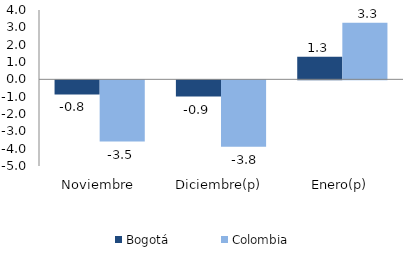
| Category | Bogotá | Colombia |
|---|---|---|
| Noviembre | -0.816 | -3.533 |
| Diciembre(p) | -0.939 | -3.835 |
| Enero(p) | 1.306 | 3.271 |